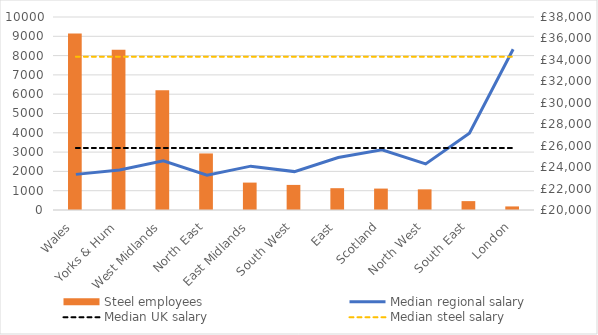
| Category | Steel employees |
|---|---|
| Wales | 9150 |
| Yorks & Hum | 8300 |
| West Midlands | 6200 |
| North East | 2930 |
| East Midlands | 1420 |
| South West | 1300 |
| East | 1130 |
| Scotland | 1110 |
| North West | 1070 |
| South East | 460 |
| London | 185 |